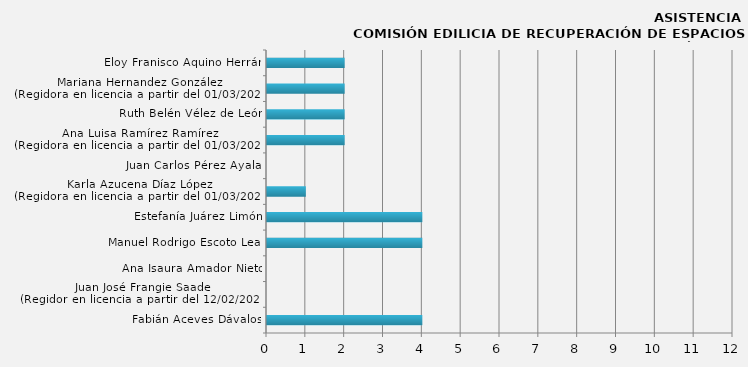
| Category | Fabián Aceves Dávalos |
|---|---|
| Fabián Aceves Dávalos | 4 |
| Juan José Frangie Saade
(Regidor en licencia a partir del 12/02/2024) | 0 |
| Ana Isaura Amador Nieto | 0 |
| Manuel Rodrigo Escoto Leal | 4 |
| Estefanía Juárez Limón | 4 |
| Karla Azucena Díaz López
(Regidora en licencia a partir del 01/03/2024) | 1 |
| Juan Carlos Pérez Ayala  | 0 |
| Ana Luisa Ramírez Ramírez
(Regidora en licencia a partir del 01/03/2024) | 2 |
| Ruth Belén Vélez de León | 2 |
| Mariana Hernandez González
(Regidora en licencia a partir del 01/03/2024) | 2 |
| Eloy Franisco Aquino Herrán | 2 |